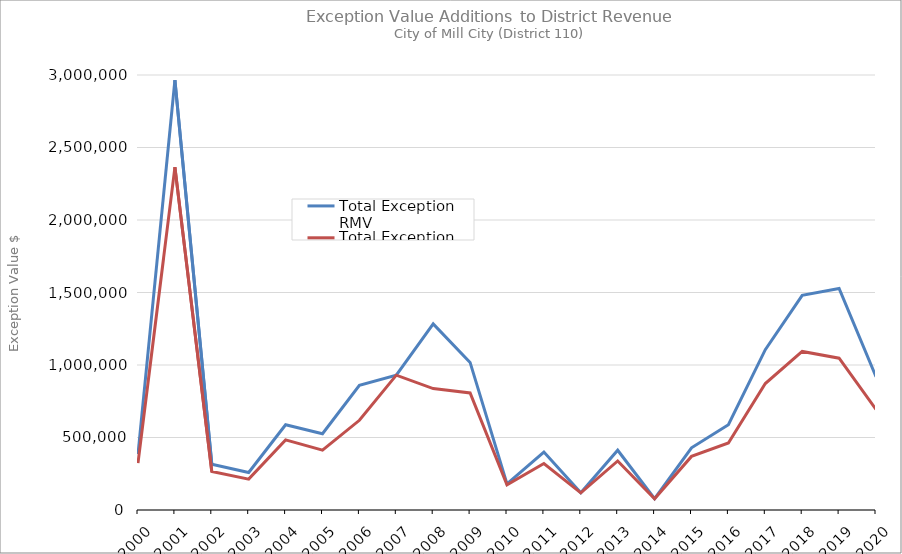
| Category | Total Exception RMV | Total Exception MAV |
|---|---|---|
| 2000.0 | 385257 | 323557 |
| 2001.0 | 2965120 | 2364210 |
| 2002.0 | 315935 | 264875 |
| 2003.0 | 258559 | 212929 |
| 2004.0 | 587895 | 483500 |
| 2005.0 | 525669 | 412469 |
| 2006.0 | 859509 | 618589 |
| 2007.0 | 929842 | 929842 |
| 2008.0 | 1283671 | 837651 |
| 2009.0 | 1017709 | 807259 |
| 2010.0 | 180381 | 173291 |
| 2011.0 | 399354 | 320974 |
| 2012.0 | 118483 | 118353 |
| 2013.0 | 412195 | 338165 |
| 2014.0 | 77596 | 77596 |
| 2015.0 | 428971 | 369671 |
| 2016.0 | 588199 | 462119 |
| 2017.0 | 1105896 | 872415 |
| 2018.0 | 1480569 | 1093399 |
| 2019.0 | 1528239 | 1046709 |
| 2020.0 | 919151 | 693841 |